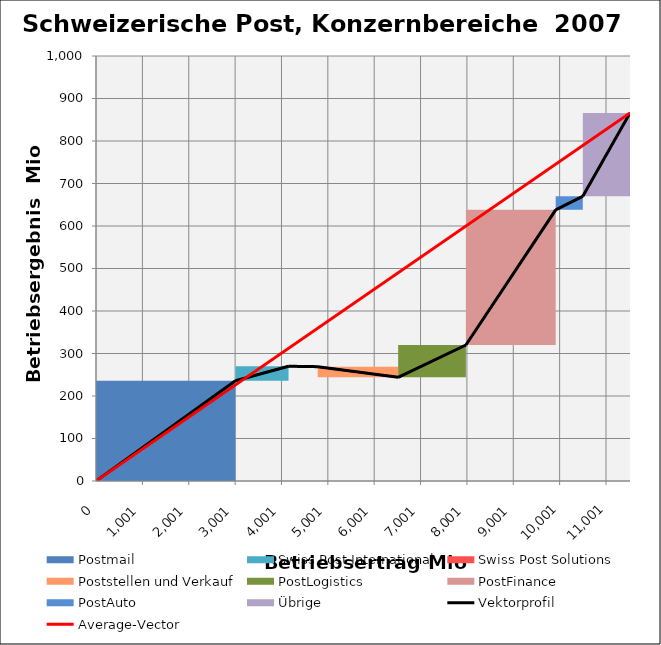
| Category | transparent | Postmail | Swiss Post International | Swiss Post Solutions | Poststellen und Verkauf | PostLogistics | PostFinance | PostAuto | Übrige | Border right & top |
|---|---|---|---|---|---|---|---|---|---|---|
| 0.0 | 0 | 236 | 0 | 0 | 0 | 0 | 0 | 0 | 0 | 0 |
| 3008.0 | 0 | 236 | 0 | 0 | 0 | 0 | 0 | 0 | 0 | 0 |
| 3008.0 | 236 | 0 | 34 | 0 | 0 | 0 | 0 | 0 | 0 | 0 |
| 4153.0 | 236 | 0 | 34 | 0 | 0 | 0 | 0 | 0 | 0 | 0 |
| 4153.0 | 270 | 0 | 0 | -1 | 0 | 0 | 0 | 0 | 0 | 0 |
| 4782.0 | 270 | 0 | 0 | -1 | 0 | 0 | 0 | 0 | 0 | 0 |
| 4782.0 | 269 | 0 | 0 | 0 | -25 | 0 | 0 | 0 | 0 | 0 |
| 6518.0 | 269 | 0 | 0 | 0 | -25 | 0 | 0 | 0 | 0 | 0 |
| 6518.0 | 244 | 0 | 0 | 0 | 0 | 76 | 0 | 0 | 0 | 0 |
| 7979.0 | 244 | 0 | 0 | 0 | 0 | 76 | 0 | 0 | 0 | 0 |
| 7979.0 | 320 | 0 | 0 | 0 | 0 | 0 | 318 | 0 | 0 | 0 |
| 9916.0 | 320 | 0 | 0 | 0 | 0 | 0 | 318 | 0 | 0 | 0 |
| 9916.0 | 638 | 0 | 0 | 0 | 0 | 0 | 0 | 32 | 0 | 0 |
| 10501.0 | 638 | 0 | 0 | 0 | 0 | 0 | 0 | 32 | 0 | 0 |
| 10501.0 | 670 | 0 | 0 | 0 | 0 | 0 | 0 | 0 | 196 | 0 |
| 11519.0 | 670 | 0 | 0 | 0 | 0 | 0 | 0 | 0 | 196 | 0 |
| 11519.0 | 866 | 0 | 0 | 0 | 0 | 0 | 0 | 0 | 0 | 0 |
| 11519.0 | 866 | 0 | 0 | 0 | 0 | 0 | 0 | 0 | 0 | 0 |
| 11519.0 | 866 | 0 | 0 | 0 | 0 | 0 | 0 | 0 | 0 | 0 |
| 11519.0 | 866 | 0 | 0 | 0 | 0 | 0 | 0 | 0 | 0 | 0 |
| 11519.0 | 866 | 0 | 0 | 0 | 0 | 0 | 0 | 0 | 0 | 0 |
| 11519.0 | 866 | 0 | 0 | 0 | 0 | 0 | 0 | 0 | 0 | 0 |
| 11519.0 | 866 | 0 | 0 | 0 | 0 | 0 | 0 | 0 | 0 | 0 |